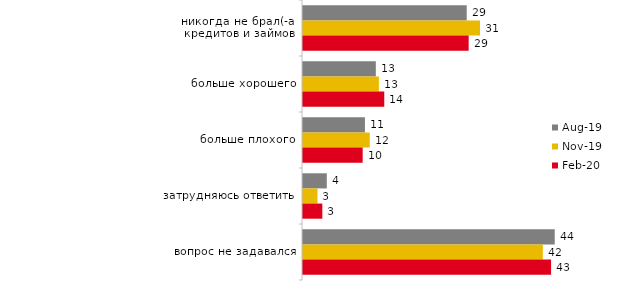
| Category | авг.19 | ноя.19 | фев.20 |
|---|---|---|---|
| никогда не брал(-а) кредитов и займов | 28.521 | 30.842 | 28.861 |
| больше хорошего | 12.687 | 13.218 | 14.158 |
| больше плохого | 10.789 | 11.634 | 10.396 |
| затрудняюсь ответить | 4.146 | 2.525 | 3.366 |
| вопрос не задавался | 43.856 | 41.782 | 43.218 |